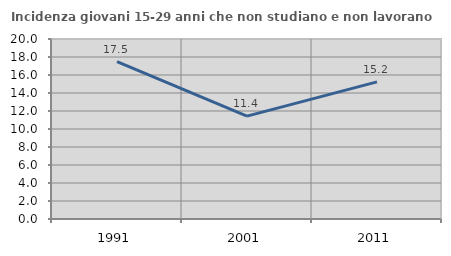
| Category | Incidenza giovani 15-29 anni che non studiano e non lavorano  |
|---|---|
| 1991.0 | 17.49 |
| 2001.0 | 11.429 |
| 2011.0 | 15.238 |